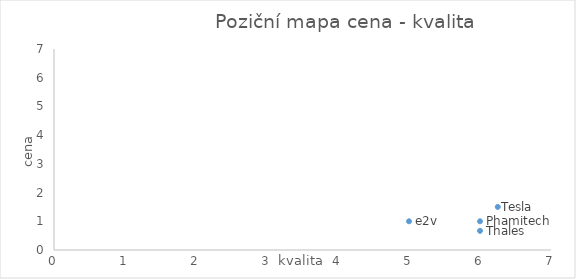
| Category | Series 0 |
|---|---|
| 6.25 | 1.5 |
| 6.0 | 0.667 |
| 5.0 | 1 |
| 6.0 | 1 |